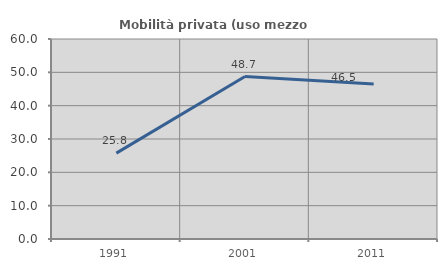
| Category | Mobilità privata (uso mezzo privato) |
|---|---|
| 1991.0 | 25.773 |
| 2001.0 | 48.725 |
| 2011.0 | 46.497 |